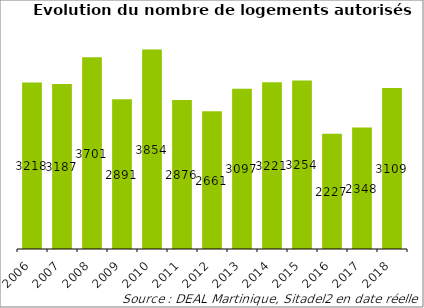
| Category | Series 0 |
|---|---|
| 2006.0 | 3218 |
| 2007.0 | 3187 |
| 2008.0 | 3701 |
| 2009.0 | 2891 |
| 2010.0 | 3854 |
| 2011.0 | 2876 |
| 2012.0 | 2661 |
| 2013.0 | 3097 |
| 2014.0 | 3221 |
| 2015.0 | 3254 |
| 2016.0 | 2227 |
| 2017.0 | 2348 |
| 2018.0 | 3109 |